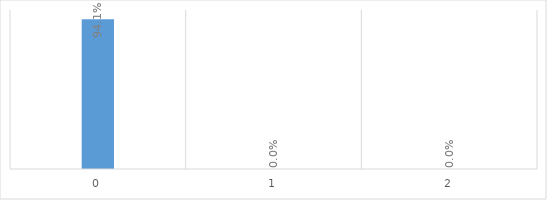
| Category | Series 0 |
|---|---|
| 0.0 | 0.941 |
| 1.0 | 0 |
| 2.0 | 0 |